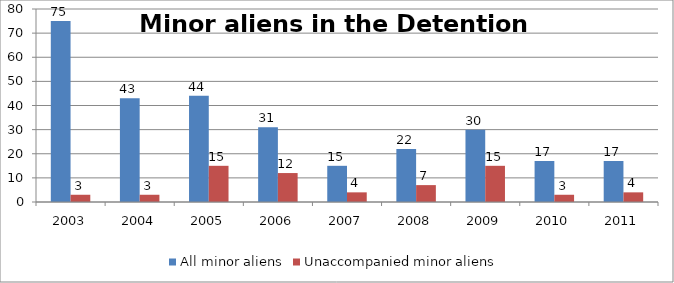
| Category | All minor aliens | Unaccompanied minor aliens |
|---|---|---|
| 2003.0 | 75 | 3 |
| 2004.0 | 43 | 3 |
| 2005.0 | 44 | 15 |
| 2006.0 | 31 | 12 |
| 2007.0 | 15 | 4 |
| 2008.0 | 22 | 7 |
| 2009.0 | 30 | 15 |
| 2010.0 | 17 | 3 |
| 2011.0 | 17 | 4 |